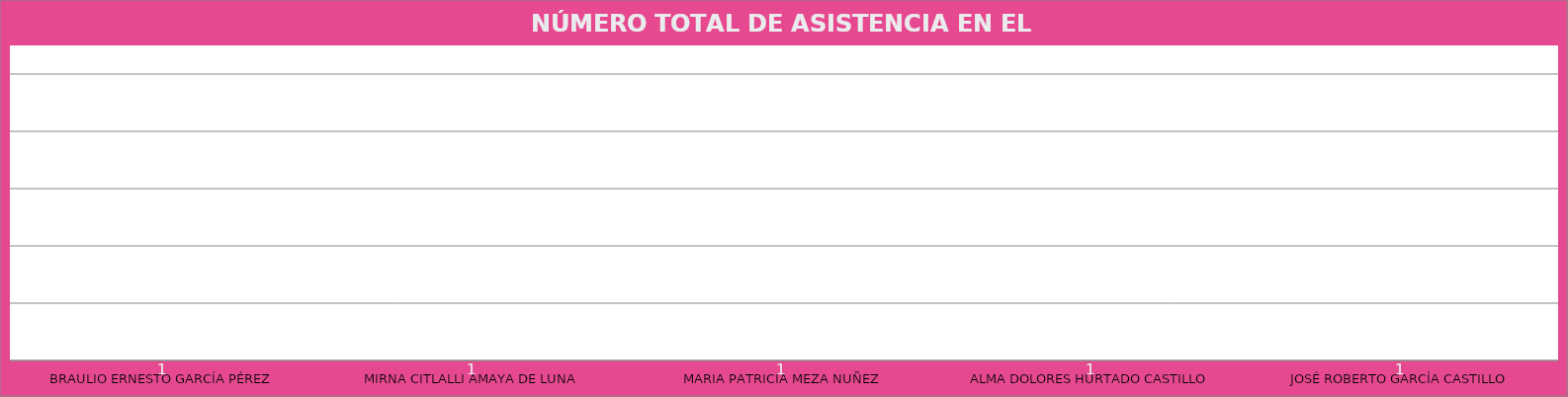
| Category | BRAULIO ERNESTO GARCÍA PÉREZ |
|---|---|
| BRAULIO ERNESTO GARCÍA PÉREZ | 1 |
| MIRNA CITLALLI AMAYA DE LUNA | 1 |
| MARIA PATRICIA MEZA NUÑEZ | 1 |
| ALMA DOLORES HURTADO CASTILLO | 1 |
| JOSÉ ROBERTO GARCÍA CASTILLO | 1 |